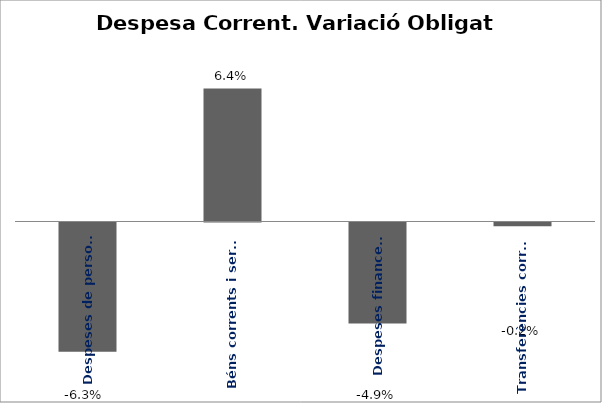
| Category | Series 0 |
|---|---|
| Despeses de personal | -0.063 |
| Béns corrents i serveis | 0.064 |
| Despeses financeres | -0.049 |
| Transferències corrents | -0.002 |